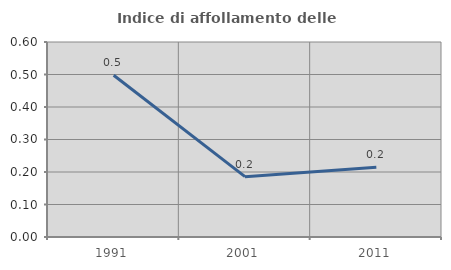
| Category | Indice di affollamento delle abitazioni  |
|---|---|
| 1991.0 | 0.498 |
| 2001.0 | 0.186 |
| 2011.0 | 0.215 |